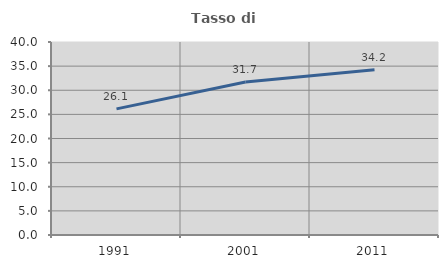
| Category | Tasso di occupazione   |
|---|---|
| 1991.0 | 26.134 |
| 2001.0 | 31.693 |
| 2011.0 | 34.249 |